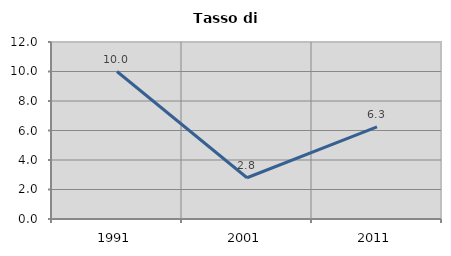
| Category | Tasso di disoccupazione   |
|---|---|
| 1991.0 | 10 |
| 2001.0 | 2.797 |
| 2011.0 | 6.25 |